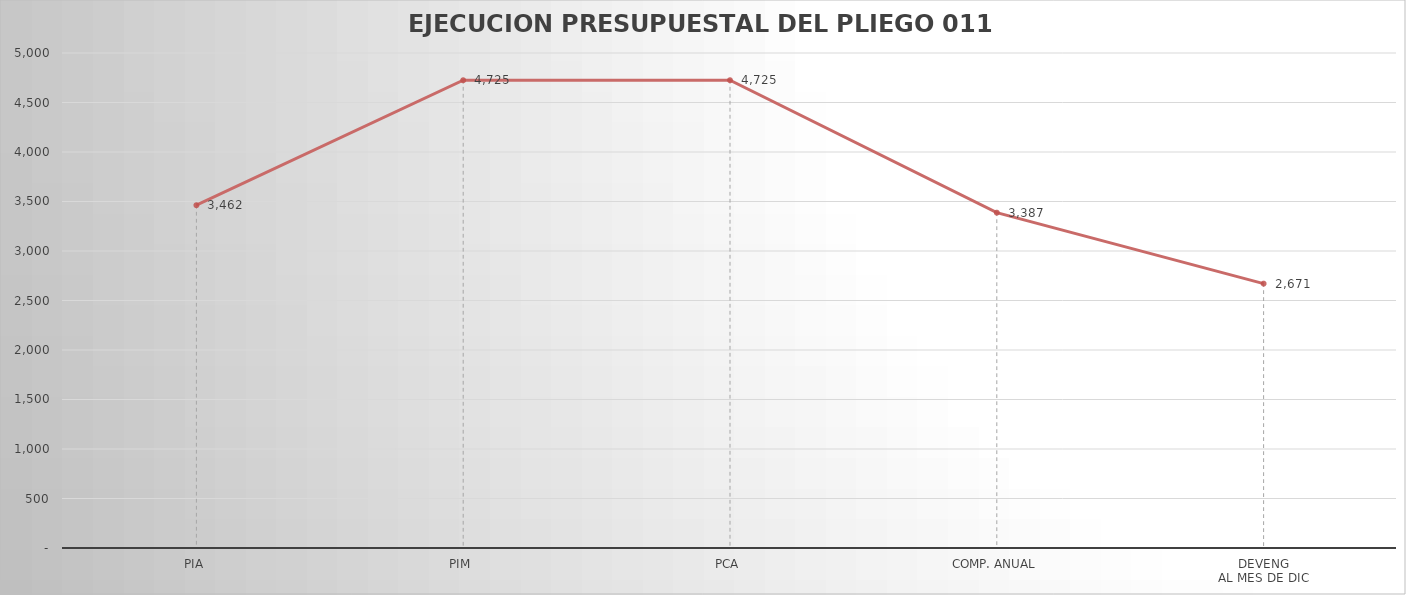
| Category | Series 0 |
|---|---|
| PIA | 3462.391 |
| PIM | 4724.751 |
| PCA | 4724.751 |
| COMP. ANUAL | 3387.105 |
| DEVENG
AL MES DE DIC | 2670.59 |